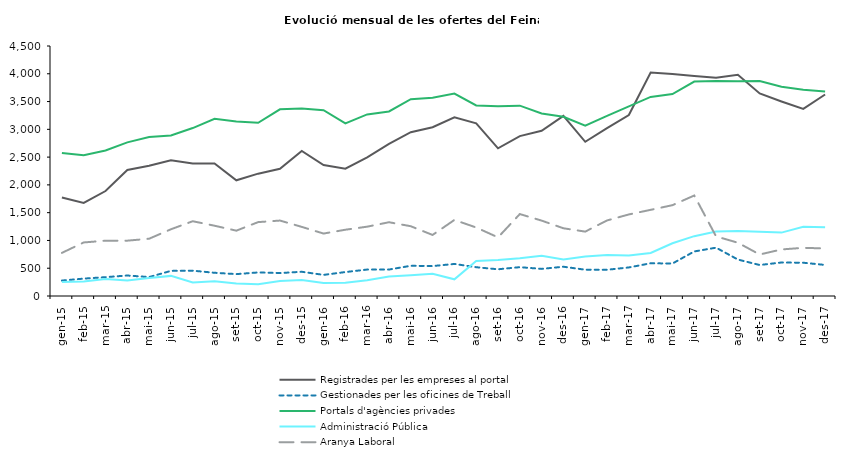
| Category | Registrades per les empreses al portal | Gestionades per les oficines de Treball | Portals d'agències privades | Administració Pública | Aranya Laboral |
|---|---|---|---|---|---|
| gen-15 | 1774 | 278 | 2575 | 250 | 776 |
| feb-15 | 1675 | 313 | 2534 | 261 | 964 |
| mar-15 | 1889 | 339 | 2619 | 304 | 995 |
| abr-15 | 2269 | 369 | 2765 | 280 | 996 |
| mai-15 | 2345 | 341 | 2860 | 325 | 1031 |
| jun-15 | 2444 | 452 | 2889 | 362 | 1201 |
| jul-15 | 2383 | 456 | 3023 | 243 | 1346 |
| ago-15 | 2385 | 418 | 3189 | 267 | 1265 |
| set-15 | 2083 | 394 | 3142 | 226 | 1176 |
| oct-15 | 2202 | 424 | 3118 | 213 | 1330 |
| nov-15 | 2289 | 413 | 3361 | 270 | 1358 |
| des-15 | 2610 | 436 | 3375 | 290 | 1244 |
| gen-16 | 2358 | 380 | 3344 | 232 | 1124 |
| feb-16 | 2291 | 431 | 3106 | 240 | 1193 |
| mar-16 | 2496 | 476 | 3268 | 282 | 1248 |
| abr-16 | 2738 | 476 | 3322 | 349 | 1328 |
| mai-16 | 2949 | 544 | 3542 | 373 | 1256 |
| jun-16 | 3037 | 539 | 3570 | 399 | 1099 |
| jul-16 | 3217 | 577 | 3643 | 300 | 1369 |
| ago-16 | 3109 | 518 | 3431 | 632 | 1233 |
| set-16 | 2658 | 481 | 3414 | 650 | 1055 |
| oct-16 | 2878 | 519 | 3426 | 680 | 1475 |
| nov-16 | 2973 | 488 | 3285 | 726 | 1357 |
| des-16 | 3241 | 527 | 3225 | 656 | 1219 |
| gen-17 | 2776 | 473 | 3065 | 709 | 1159 |
| feb-17 | 3021 | 472 | 3243 | 738 | 1360 |
| mar-17 | 3257 | 514 | 3412 | 729 | 1468 |
| abr-17 | 4024 | 589 | 3584 | 775 | 1551 |
| mai-17 | 3995 | 585 | 3634 | 950 | 1635 |
| jun-17 | 3958 | 802 | 3860 | 1077 | 1809 |
| jul-17 | 3929 | 870 | 3870 | 1159 | 1073 |
| ago-17 | 3983 | 656 | 3866 | 1171 | 959 |
| set-17 | 3646 | 558 | 3869 | 1157 | 747 |
| oct-17 | 3502 | 603 | 3766 | 1141 | 838 |
| nov-17 | 3367 | 599 | 3713 | 1246 | 867 |
| des-17 | 3627 | 559 | 3680 | 1237 | 856 |